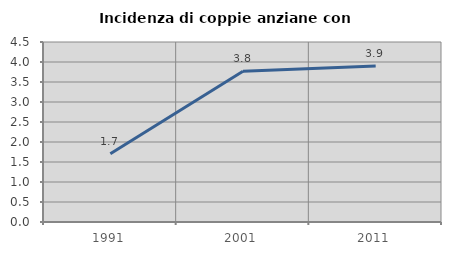
| Category | Incidenza di coppie anziane con figli |
|---|---|
| 1991.0 | 1.706 |
| 2001.0 | 3.767 |
| 2011.0 | 3.902 |